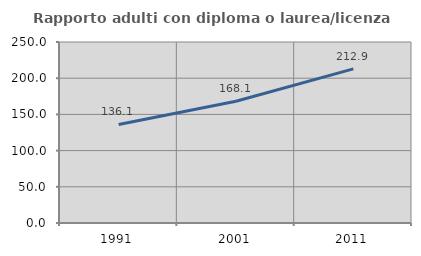
| Category | Rapporto adulti con diploma o laurea/licenza media  |
|---|---|
| 1991.0 | 136.136 |
| 2001.0 | 168.121 |
| 2011.0 | 212.917 |